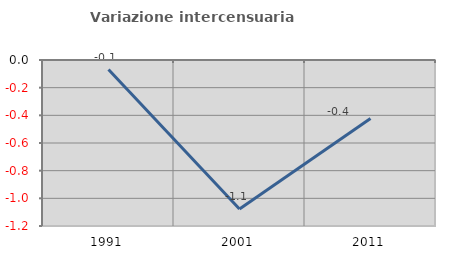
| Category | Variazione intercensuaria annua |
|---|---|
| 1991.0 | -0.069 |
| 2001.0 | -1.078 |
| 2011.0 | -0.423 |